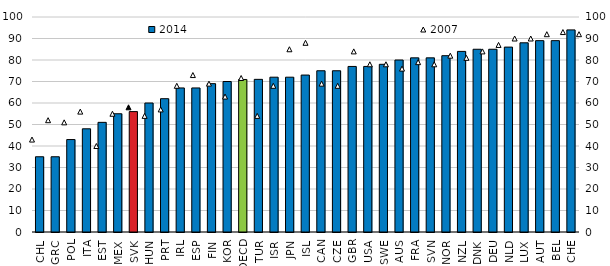
| Category | 2014 |
|---|---|
| CHL | 35 |
| GRC | 35 |
| POL | 43 |
| ITA | 48 |
| EST | 51 |
| MEX | 55 |
| SVK | 56 |
| HUN | 60 |
| PRT | 62 |
| IRL | 67 |
| ESP | 67 |
| FIN | 69 |
| KOR | 70 |
| OECD | 70.941 |
| TUR | 71 |
| ISR | 72 |
| JPN | 72 |
| ISL | 73 |
| CAN | 75 |
| CZE | 75 |
| GBR | 77 |
| USA | 77 |
| SWE | 78 |
| AUS | 80 |
| FRA | 81 |
| SVN | 81 |
| NOR | 82 |
| NZL | 84 |
| DNK | 85 |
| DEU | 85 |
| NLD | 86 |
| LUX | 88 |
| AUT | 89 |
| BEL | 89 |
| CHE | 94 |